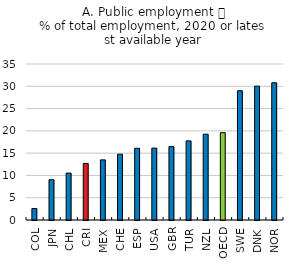
| Category | Series 0 |
|---|---|
| COL | 2.562 |
| JPN | 9.035 |
| CHL | 10.532 |
| CRI | 12.68 |
| MEX | 13.487 |
| CHE | 14.755 |
| ESP | 16.088 |
| USA | 16.129 |
| GBR | 16.469 |
| TUR | 17.751 |
| NZL | 19.253 |
| OECD | 19.594 |
| SWE | 29.005 |
| DNK | 30.031 |
| NOR | 30.787 |